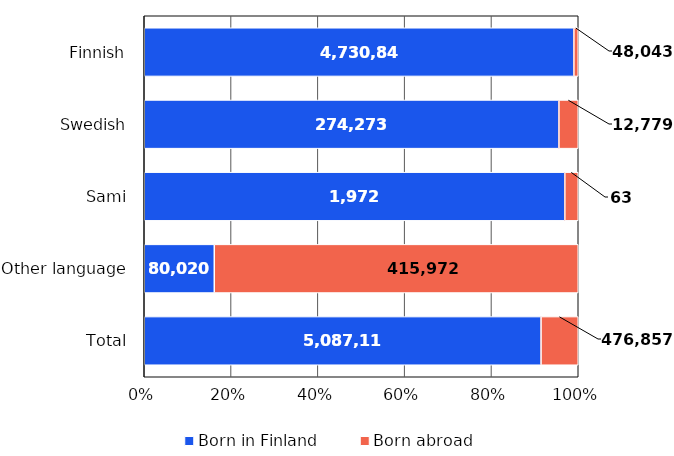
| Category | Born in Finland | Born abroad |
|---|---|---|
| Finnish | 4730848 | 48043 |
| Swedish | 274273 | 12779 |
| Sami | 1972 | 63 |
| Other language | 80020 | 415972 |
| Total | 5087113 | 476857 |